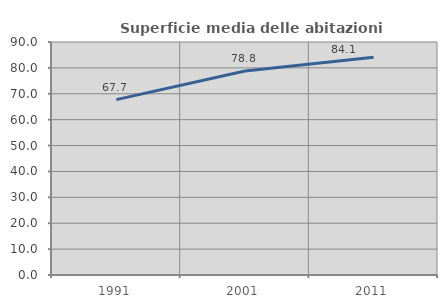
| Category | Superficie media delle abitazioni occupate |
|---|---|
| 1991.0 | 67.743 |
| 2001.0 | 78.782 |
| 2011.0 | 84.066 |